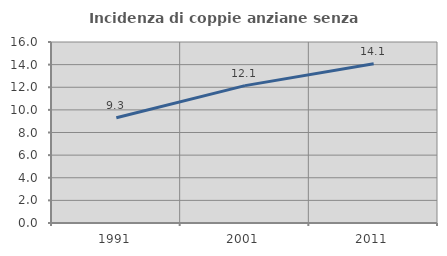
| Category | Incidenza di coppie anziane senza figli  |
|---|---|
| 1991.0 | 9.306 |
| 2001.0 | 12.142 |
| 2011.0 | 14.075 |